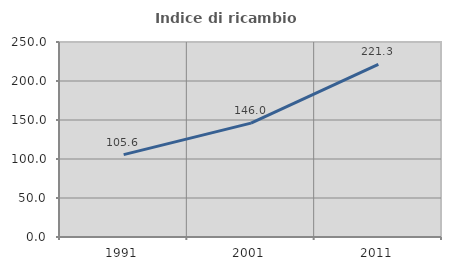
| Category | Indice di ricambio occupazionale  |
|---|---|
| 1991.0 | 105.634 |
| 2001.0 | 146.009 |
| 2011.0 | 221.302 |